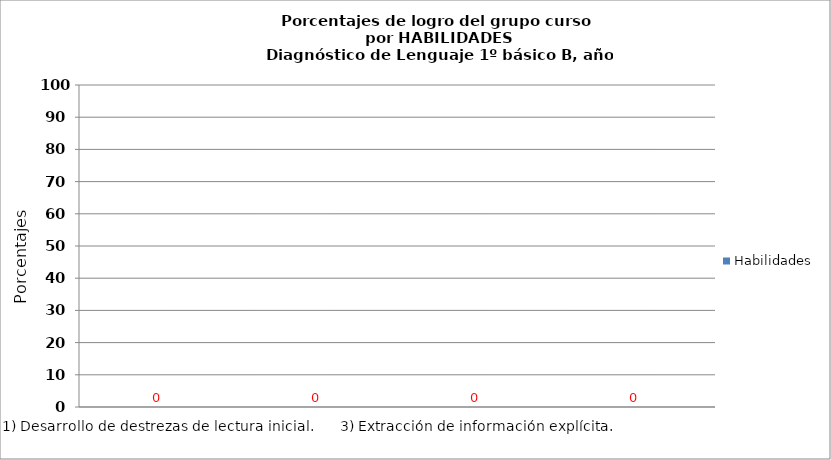
| Category | Habilidades |
|---|---|
| 1) Desarrollo de destrezas de lectura inicial. | 0 |
| 2) Reflexión sobre el texto | 0 |
| 3) Extracción de información explícita. | 0 |
| 4) Extracción de información implícita. | 0 |